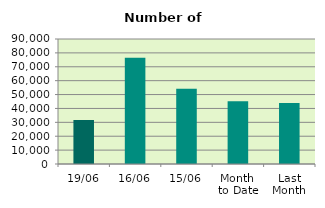
| Category | Series 0 |
|---|---|
| 19/06 | 31744 |
| 16/06 | 76558 |
| 15/06 | 54160 |
| Month 
to Date | 45111.846 |
| Last
Month | 44009.364 |